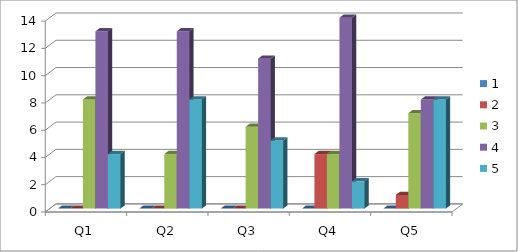
| Category | 1 | 2 | 3 | 4 | 5 |
|---|---|---|---|---|---|
| Q1 | 0 | 0 | 8 | 13 | 4 |
| Q2 | 0 | 0 | 4 | 13 | 8 |
| Q3 | 0 | 0 | 6 | 11 | 5 |
| Q4 | 0 | 4 | 4 | 14 | 2 |
| Q5 | 0 | 1 | 7 | 8 | 8 |